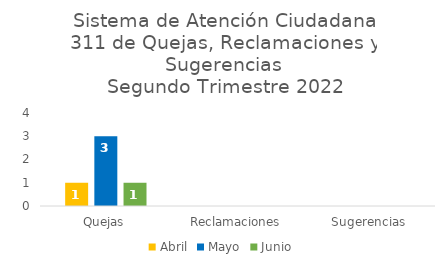
| Category | Abril | Mayo | Junio |
|---|---|---|---|
| Quejas | 1 | 3 | 1 |
| Reclamaciones | 0 | 0 | 0 |
| Sugerencias | 0 | 0 | 0 |